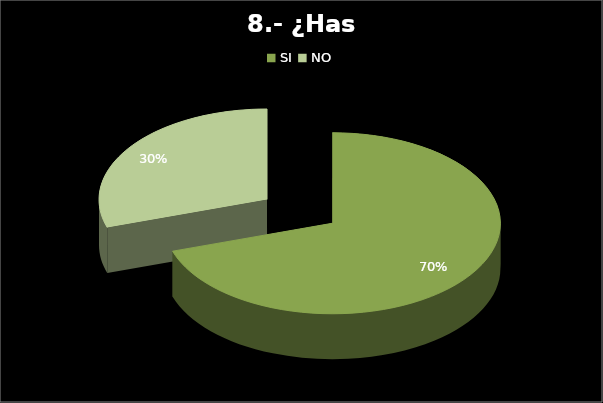
| Category | Series 0 |
|---|---|
| SI  | 56 |
| NO | 24 |